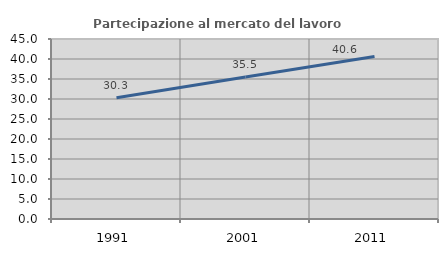
| Category | Partecipazione al mercato del lavoro  femminile |
|---|---|
| 1991.0 | 30.311 |
| 2001.0 | 35.507 |
| 2011.0 | 40.649 |